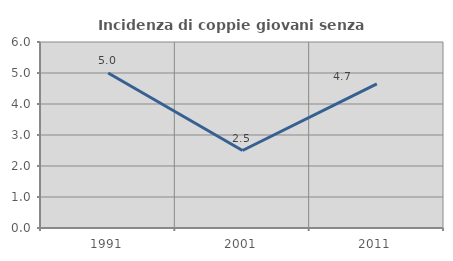
| Category | Incidenza di coppie giovani senza figli |
|---|---|
| 1991.0 | 5 |
| 2001.0 | 2.5 |
| 2011.0 | 4.651 |